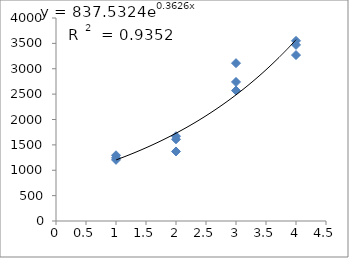
| Category | Series 0 |
|---|---|
| 1.0 | 1205 |
| 1.0 | 1295 |
| 1.0 | 1245 |
| 2.0 | 1670 |
| 2.0 | 1610 |
| 2.0 | 1370 |
| 3.0 | 3110 |
| 3.0 | 2570 |
| 3.0 | 2740 |
| 4.0 | 3270 |
| 4.0 | 3550 |
| 4.0 | 3470 |